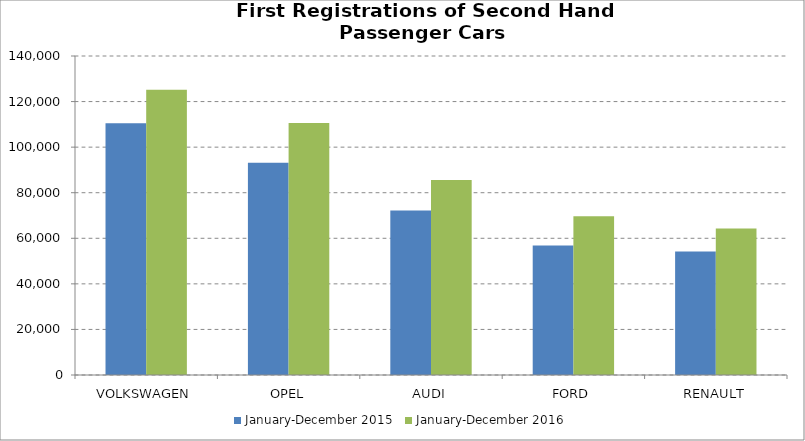
| Category | January-December 2015 | January-December 2016 |
|---|---|---|
| VOLKSWAGEN | 110493 | 125239 |
| OPEL | 93109 | 110564 |
| AUDI | 72143 | 85552 |
| FORD | 56870 | 69693 |
| RENAULT | 54221 | 64328 |